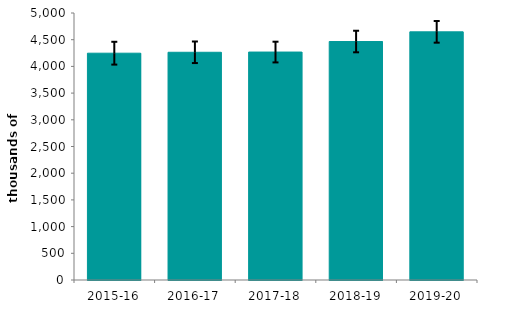
| Category | Series 0 |
|---|---|
| 2015-16 | 4247.297 |
| 2016-17 | 4264.586 |
| 2017-18 | 4268.524 |
| 2018-19 | 4465.893 |
| 2019-20 | 4647.394 |